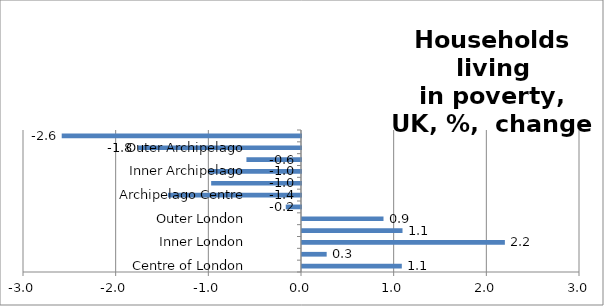
| Category | Series 0 |
|---|---|
| Centre of London | 1.077 |
| London Core | 0.266 |
| Inner London | 2.189 |
| London Suburbs | 1.085 |
| Outer London | 0.88 |
| London Edge | -0.164 |
| Archipelago Centre | -1.435 |
| Archipelago Core | -0.969 |
| Inner Archipelago | -1.003 |
| Archipelago Suburbs | -0.589 |
| Outer Archipelago | -1.759 |
| Archipelago Edge | -2.582 |